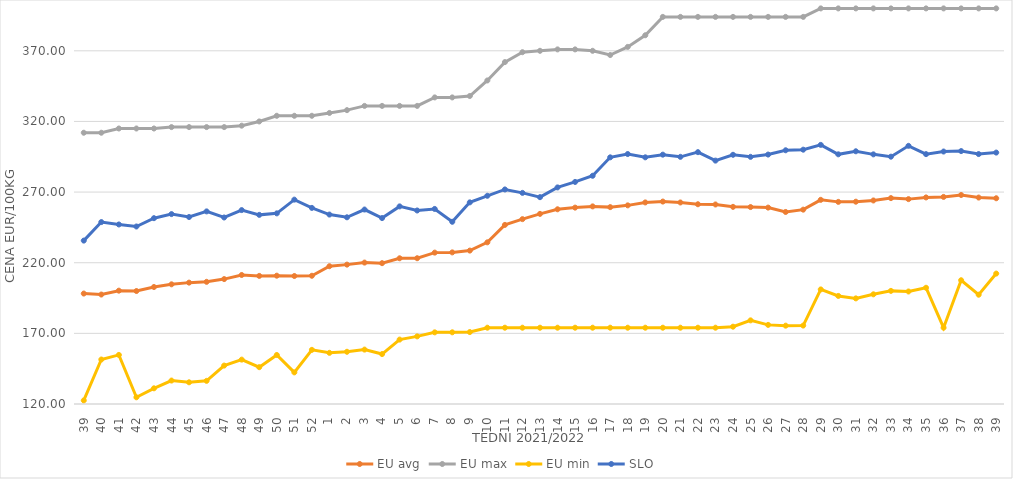
| Category | EU avg | EU max | EU min | SLO |
|---|---|---|---|---|
| 39.0 | 198.179 | 312 | 122.517 | 235.66 |
| 40.0 | 197.482 | 312 | 151.488 | 248.77 |
| 41.0 | 200.22 | 315 | 154.74 | 247.07 |
| 42.0 | 199.965 | 315 | 124.748 | 245.64 |
| 43.0 | 202.804 | 315 | 131.104 | 251.53 |
| 44.0 | 204.713 | 316 | 136.6 | 254.42 |
| 45.0 | 205.906 | 316 | 135.362 | 252.35 |
| 46.0 | 206.476 | 316 | 136.39 | 256.33 |
| 47.0 | 208.415 | 316 | 147.192 | 252.01 |
| 48.0 | 211.314 | 317 | 151.41 | 257.25 |
| 49.0 | 210.677 | 320 | 146.064 | 253.87 |
| 50.0 | 210.823 | 324 | 154.698 | 254.94 |
| 51.0 | 210.59 | 324 | 142.382 | 264.65 |
| 52.0 | 210.763 | 324 | 158.333 | 258.8 |
| 1.0 | 217.519 | 326 | 156.222 | 254.09 |
| 2.0 | 218.654 | 328 | 156.969 | 252.15 |
| 3.0 | 220.098 | 331 | 158.511 | 257.65 |
| 4.0 | 219.685 | 331 | 155.346 | 251.6 |
| 5.0 | 223.143 | 331 | 165.59 | 259.87 |
| 6.0 | 223.178 | 331 | 167.86 | 256.97 |
| 7.0 | 227.145 | 337 | 170.719 | 258.07 |
| 8.0 | 227.312 | 337 | 170.743 | 248.97 |
| 9.0 | 228.588 | 338 | 170.92 | 262.72 |
| 10.0 | 234.434 | 349 | 174 | 267.38 |
| 11.0 | 246.762 | 362 | 174 | 271.86 |
| 12.0 | 250.845 | 369 | 174 | 269.43 |
| 13.0 | 254.568 | 370 | 174 | 266.39 |
| 14.0 | 257.819 | 371 | 174 | 273.3 |
| 15.0 | 259 | 371 | 174 | 277.18 |
| 16.0 | 259.873 | 370 | 174 | 281.55 |
| 17.0 | 259.351 | 367 | 174 | 294.59 |
| 18.0 | 260.6 | 372.758 | 174 | 296.93 |
| 19.0 | 262.669 | 381 | 174 | 294.6 |
| 20.0 | 263.291 | 394 | 174 | 296.48 |
| 21.0 | 262.64 | 394 | 174 | 294.94 |
| 22.0 | 261.388 | 394 | 174 | 298.26 |
| 23.0 | 261.228 | 394 | 174 | 292.27 |
| 24.0 | 259.544 | 394 | 174.72 | 296.39 |
| 25.0 | 259.395 | 394 | 179.2 | 294.93 |
| 26.0 | 259.018 | 394 | 176 | 296.56 |
| 27.0 | 255.922 | 394 | 175.451 | 299.59 |
| 28.0 | 257.564 | 394 | 175.52 | 300.01 |
| 29.0 | 264.52 | 400 | 201.097 | 303.41 |
| 30.0 | 263.067 | 400 | 196.496 | 296.73 |
| 31.0 | 263.196 | 400 | 194.756 | 298.88 |
| 32.0 | 264.059 | 400 | 197.634 | 296.7 |
| 33.0 | 265.729 | 400 | 200.07 | 295.05 |
| 34.0 | 265.016 | 400 | 199.637 | 302.73 |
| 35.0 | 266.209 | 400 | 202.277 | 296.86 |
| 36.0 | 266.582 | 400 | 174 | 298.7 |
| 37.0 | 267.928 | 400 | 207.594 | 299.02 |
| 38.0 | 266.122 | 400 | 197.352 | 296.91 |
| 39.0 | 265.629 | 400 | 212.318 | 297.96 |